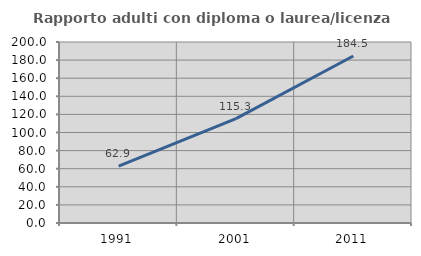
| Category | Rapporto adulti con diploma o laurea/licenza media  |
|---|---|
| 1991.0 | 62.87 |
| 2001.0 | 115.258 |
| 2011.0 | 184.541 |